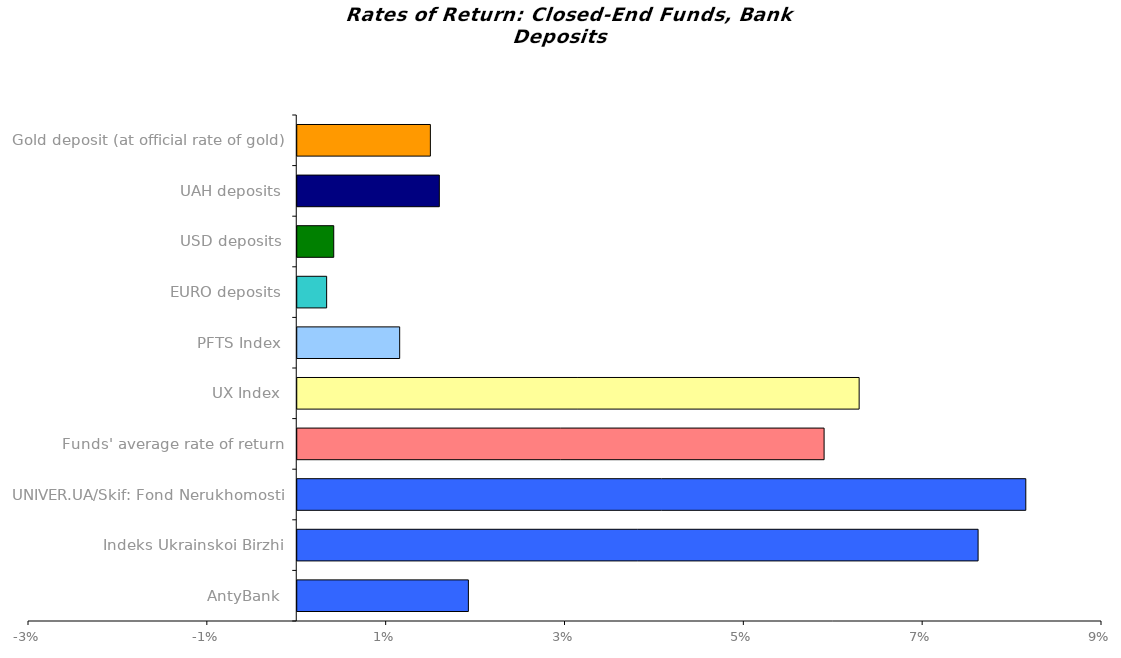
| Category | Series 0 |
|---|---|
| AntyBank | 0.019 |
| Indeks Ukrainskoi Birzhi | 0.076 |
| UNIVER.UA/Skif: Fond Nerukhomosti | 0.081 |
| Funds' average rate of return | 0.059 |
| UX Index | 0.063 |
| PFTS Index | 0.011 |
| EURO deposits | 0.003 |
| USD deposits | 0.004 |
| UAH deposits | 0.016 |
| Gold deposit (at official rate of gold) | 0.015 |